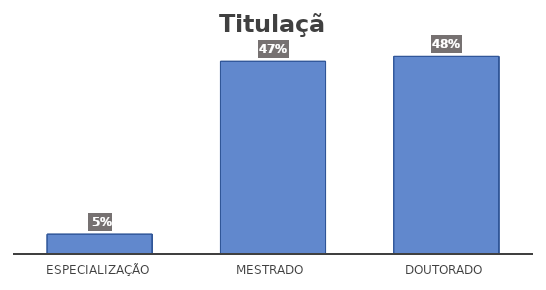
| Category | Series 0 |
|---|---|
| Especialização | 0.048 |
| Mestrado | 0.47 |
| Doutorado | 0.482 |